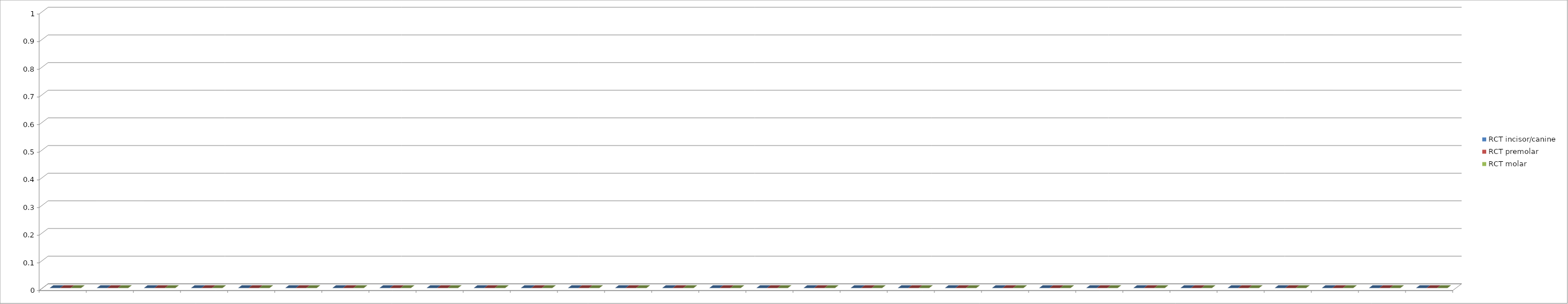
| Category | RCT incisor/canine | RCT premolar | RCT molar |
|---|---|---|---|
| 0 | 0 | 0 | 0 |
| 1 | 0 | 0 | 0 |
| 2 | 0 | 0 | 0 |
| 3 | 0 | 0 | 0 |
| 4 | 0 | 0 | 0 |
| 5 | 0 | 0 | 0 |
| 6 | 0 | 0 | 0 |
| 7 | 0 | 0 | 0 |
| 8 | 0 | 0 | 0 |
| 9 | 0 | 0 | 0 |
| 10 | 0 | 0 | 0 |
| 11 | 0 | 0 | 0 |
| 12 | 0 | 0 | 0 |
| 13 | 0 | 0 | 0 |
| 14 | 0 | 0 | 0 |
| 15 | 0 | 0 | 0 |
| 16 | 0 | 0 | 0 |
| 17 | 0 | 0 | 0 |
| 18 | 0 | 0 | 0 |
| 19 | 0 | 0 | 0 |
| 20 | 0 | 0 | 0 |
| 21 | 0 | 0 | 0 |
| 22 | 0 | 0 | 0 |
| 23 | 0 | 0 | 0 |
| 24 | 0 | 0 | 0 |
| 25 | 0 | 0 | 0 |
| 26 | 0 | 0 | 0 |
| 27 | 0 | 0 | 0 |
| 28 | 0 | 0 | 0 |
| 29 | 0 | 0 | 0 |